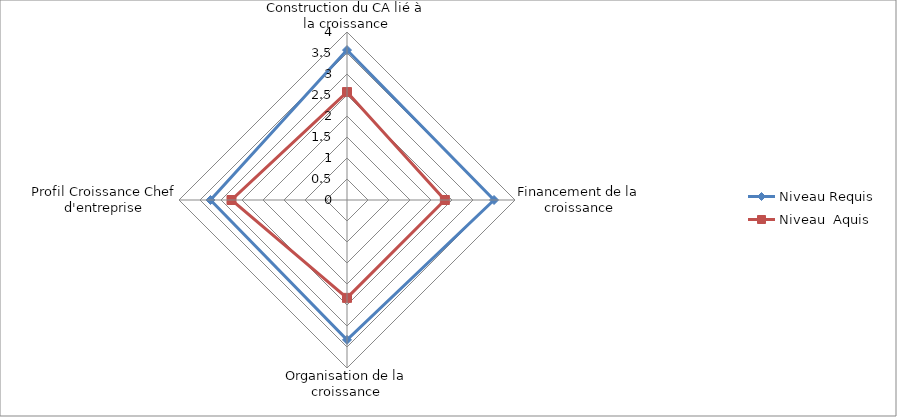
| Category | Niveau Requis  | Niveau  Aquis  |
|---|---|---|
| Construction du CA lié à la croissance | 3.57 | 2.57 |
| Financement de la croissance | 3.5 | 2.33 |
| Organisation de la croissance | 3.33 | 2.33 |
| Profil Croissance Chef d'entreprise | 3.25 | 2.75 |